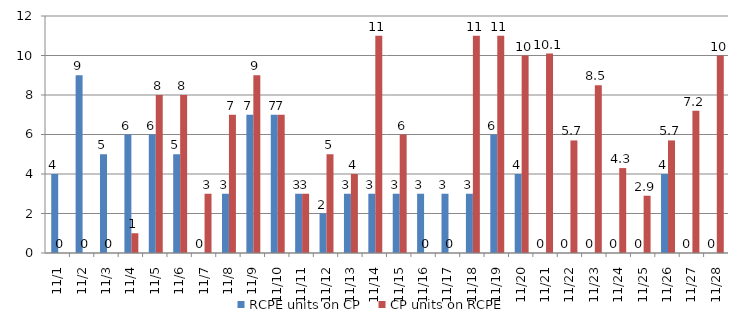
| Category | RCPE units on CP | CP units on RCPE |
|---|---|---|
| 2015-11-01 | 4 | 0 |
| 2015-11-02 | 9 | 0 |
| 2015-11-03 | 5 | 0 |
| 2015-11-04 | 6 | 1 |
| 2015-11-05 | 6 | 8 |
| 2015-11-06 | 5 | 8 |
| 2015-11-07 | 0 | 3 |
| 2015-11-08 | 3 | 7 |
| 2015-11-09 | 7 | 9 |
| 2015-11-10 | 7 | 7 |
| 2015-11-11 | 3 | 3 |
| 2015-11-12 | 2 | 5 |
| 2015-11-13 | 3 | 4 |
| 2015-11-14 | 3 | 11 |
| 2015-11-15 | 3 | 6 |
| 2015-11-16 | 3 | 0 |
| 2015-11-17 | 3 | 0 |
| 2015-11-18 | 3 | 11 |
| 2015-11-19 | 6 | 11 |
| 2015-11-20 | 4 | 10 |
| 2015-11-21 | 0 | 10.1 |
| 2015-11-22 | 0 | 5.7 |
| 2015-11-23 | 0 | 8.5 |
| 2015-11-24 | 0 | 4.3 |
| 2015-11-25 | 0 | 2.9 |
| 2015-11-26 | 4 | 5.7 |
| 2015-11-27 | 0 | 7.2 |
| 2015-11-28 | 0 | 10 |